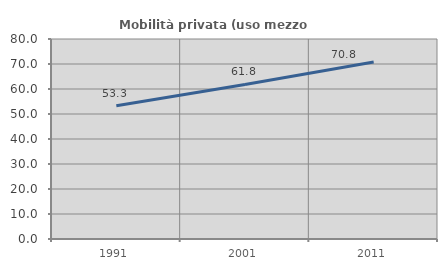
| Category | Mobilità privata (uso mezzo privato) |
|---|---|
| 1991.0 | 53.26 |
| 2001.0 | 61.81 |
| 2011.0 | 70.831 |